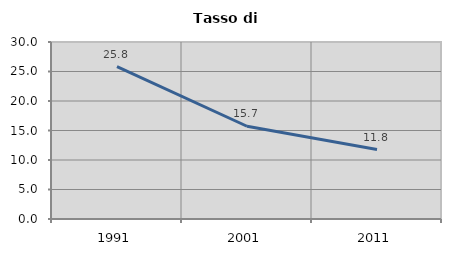
| Category | Tasso di disoccupazione   |
|---|---|
| 1991.0 | 25.827 |
| 2001.0 | 15.719 |
| 2011.0 | 11.77 |